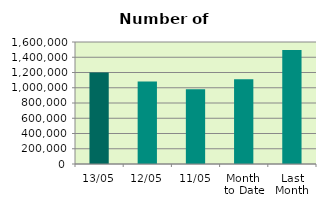
| Category | Series 0 |
|---|---|
| 13/05 | 1200992 |
| 12/05 | 1082052 |
| 11/05 | 978778 |
| Month 
to Date | 1111915 |
| Last
Month | 1493476.8 |